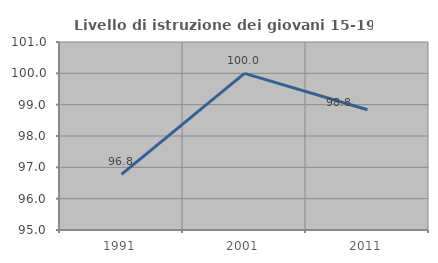
| Category | Livello di istruzione dei giovani 15-19 anni |
|---|---|
| 1991.0 | 96.774 |
| 2001.0 | 100 |
| 2011.0 | 98.837 |